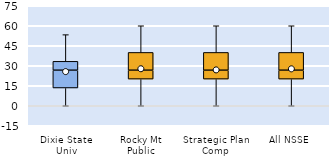
| Category | 25th | 50th | 75th |
|---|---|---|---|
| Dixie State Univ | 13.333 | 13.333 | 6.667 |
| Rocky Mt Public | 20 | 6.667 | 13.333 |
| Strategic Plan Comp | 20 | 6.667 | 13.333 |
| All NSSE | 20 | 6.667 | 13.333 |